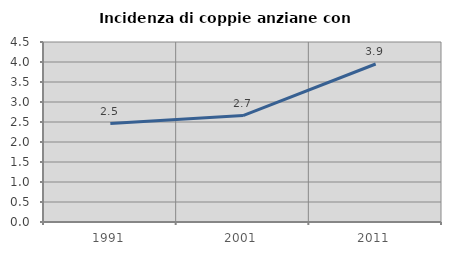
| Category | Incidenza di coppie anziane con figli |
|---|---|
| 1991.0 | 2.462 |
| 2001.0 | 2.66 |
| 2011.0 | 3.95 |